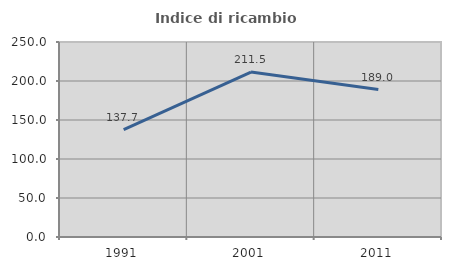
| Category | Indice di ricambio occupazionale  |
|---|---|
| 1991.0 | 137.662 |
| 2001.0 | 211.513 |
| 2011.0 | 189.016 |